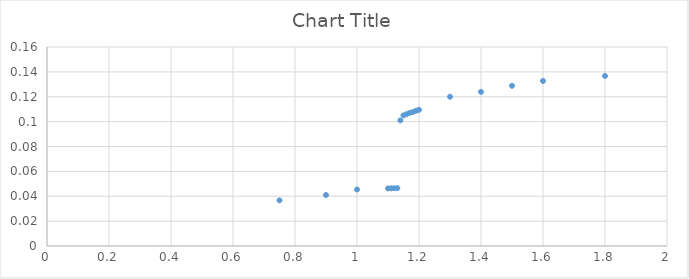
| Category | Series 0 |
|---|---|
| 0.75 | 0.037 |
| 0.9 | 0.041 |
| 1.0 | 0.045 |
| 1.1 | 0.046 |
| 1.11 | 0.046 |
| 1.12 | 0.046 |
| 1.13 | 0.046 |
| 1.14 | 0.101 |
| 1.15 | 0.105 |
| 1.16 | 0.106 |
| 1.17 | 0.107 |
| 1.18 | 0.108 |
| 1.19 | 0.109 |
| 1.2 | 0.11 |
| 1.3 | 0.12 |
| 1.4 | 0.124 |
| 1.5 | 0.129 |
| 1.6 | 0.133 |
| 1.8 | 0.137 |